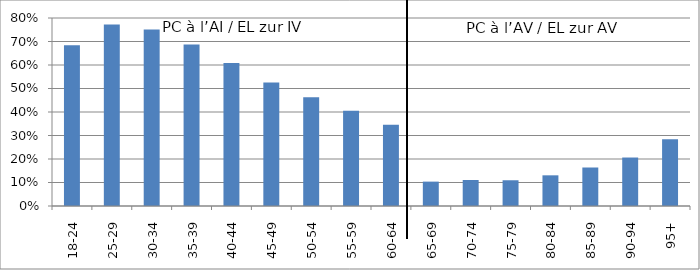
| Category | PC à l’AI / EL zur IV PC à l’AV / EL zur AV |
|---|---|
| 18-24 | 0.684 |
| 25-29 | 0.773 |
| 30-34 | 0.751 |
| 35-39 | 0.687 |
| 40-44 | 0.609 |
| 45-49 | 0.526 |
| 50-54 | 0.463 |
| 55-59 | 0.406 |
| 60-64 | 0.345 |
| 65-69 | 0.104 |
| 70-74 | 0.111 |
| 75-79 | 0.11 |
| 80-84 | 0.131 |
| 85-89 | 0.164 |
| 90-94 | 0.206 |
| 95+ | 0.284 |